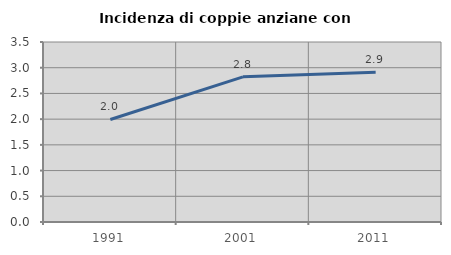
| Category | Incidenza di coppie anziane con figli |
|---|---|
| 1991.0 | 1.994 |
| 2001.0 | 2.823 |
| 2011.0 | 2.912 |